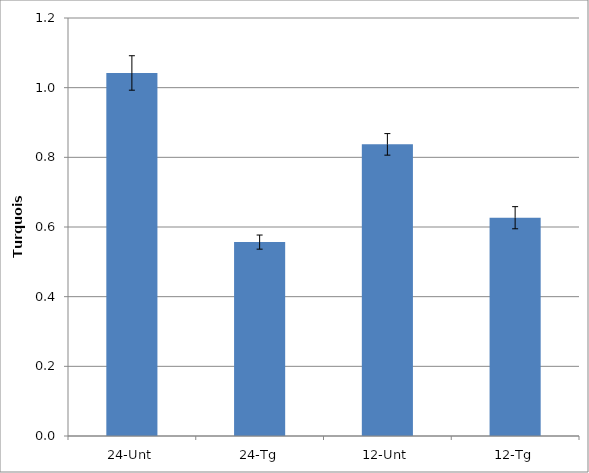
| Category | Turquoise |
|---|---|
| 24-Unt | 1.042 |
| 24-Tg | 0.557 |
| 12-Unt | 0.837 |
| 12-Tg | 0.627 |